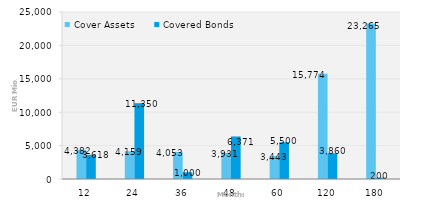
| Category | Cover Assets | Covered Bonds |
|---|---|---|
| 12.0 | 4382.415 | 3617.593 |
| 24.0 | 4158.795 | 11350 |
| 36.0 | 4053.113 | 1000 |
| 48.0 | 3930.916 | 6371.282 |
| 60.0 | 3443.206 | 5500 |
| 120.0 | 15773.637 | 3860.123 |
| 180.0 | 23265.061 | 200 |